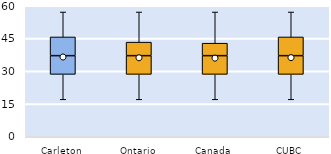
| Category | 25th | 50th | 75th |
|---|---|---|---|
| Carleton | 28.571 | 8.571 | 8.571 |
| Ontario | 28.571 | 8.571 | 6.19 |
| Canada | 28.571 | 8.571 | 5.714 |
| CUBC | 28.571 | 8.571 | 8.571 |